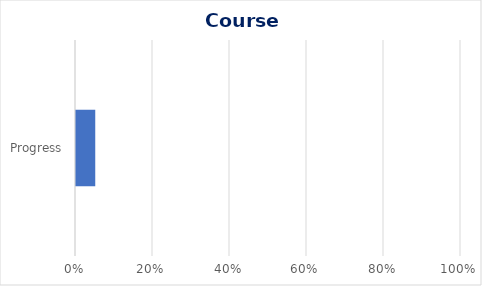
| Category | Series 0 |
|---|---|
| 0 | 0.05 |